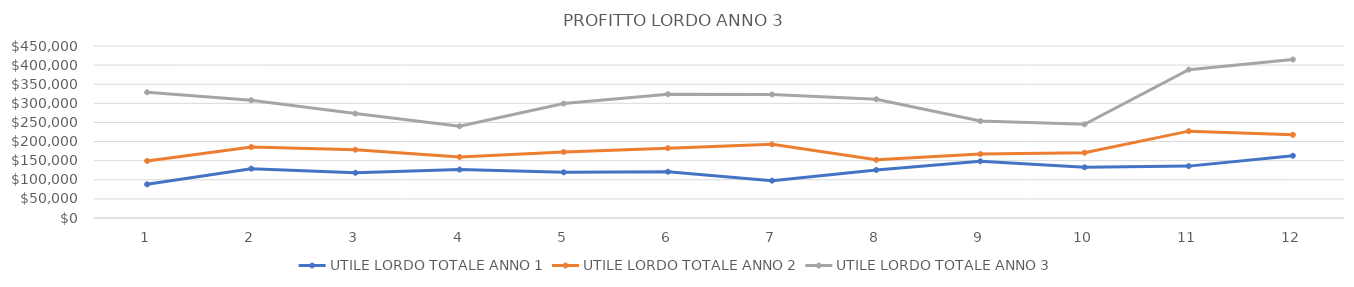
| Category | UTILE LORDO TOTALE ANNO 1 | UTILE LORDO TOTALE ANNO 2 | UTILE LORDO TOTALE ANNO 3 |
|---|---|---|---|
| 0 | 88114 | 149299.8 | 328920.1 |
| 1 | 129087 | 185572.05 | 307938.2 |
| 2 | 118320 | 178734.75 | 273173.6 |
| 3 | 126600 | 159643.5 | 240058.1 |
| 4 | 119528 | 172671.8 | 299376.2 |
| 5 | 121091.5 | 182784.4 | 323907 |
| 6 | 97705.5 | 192648.75 | 323256.1 |
| 7 | 125637 | 152163.2 | 310748.5 |
| 8 | 148434 | 167284.6 | 253671.3 |
| 9 | 132710 | 170910.05 | 245075.1 |
| 10 | 135723 | 227271.75 | 388017.1 |
| 11 | 162928 | 217656 | 414703.8 |